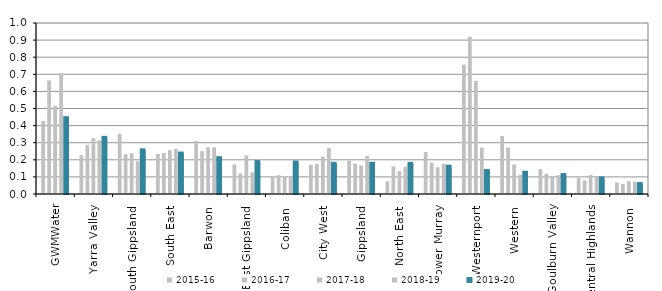
| Category | 2015-16 | 2016-17 | 2017-18 | 2018-19 | 2019-20 |
|---|---|---|---|---|---|
| GWMWater | 0.426 | 0.663 | 0.515 | 0.706 | 0.443 |
| Yarra Valley  | 0.227 | 0.288 | 0.326 | 0.314 | 0.328 |
| South Gippsland  | 0.353 | 0.233 | 0.238 | 0.191 | 0.255 |
| South East  | 0.234 | 0.239 | 0.257 | 0.263 | 0.237 |
| Barwon  | 0.31 | 0.25 | 0.273 | 0.273 | 0.209 |
| East Gippsland  | 0.173 | 0.12 | 0.225 | 0.127 | 0.187 |
| Coliban  | 0.098 | 0.11 | 0.101 | 0.098 | 0.184 |
| City West  | 0.17 | 0.175 | 0.218 | 0.27 | 0.177 |
| Gippsland  | 0.194 | 0.177 | 0.167 | 0.223 | 0.176 |
| North East  | 0.074 | 0.162 | 0.134 | 0.16 | 0.176 |
| Lower Murray  | 0.246 | 0.184 | 0.156 | 0.176 | 0.16 |
| Westernport  | 0.757 | 0.92 | 0.661 | 0.271 | 0.135 |
| Western  | 0.339 | 0.271 | 0.173 | 0.112 | 0.124 |
| Goulburn Valley  | 0.146 | 0.118 | 0.099 | 0.11 | 0.11 |
| Central Highlands  | 0.095 | 0.08 | 0.111 | 0.102 | 0.091 |
| Wannon  | 0.068 | 0.059 | 0.075 | 0.072 | 0.058 |